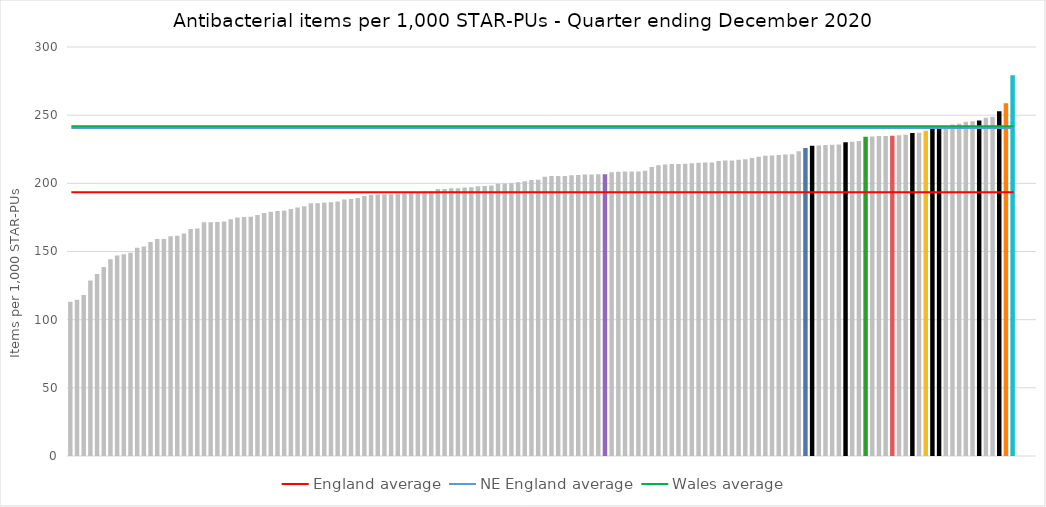
| Category | Series 0 |
|---|---|
| English CCGs | 113.118 |
| English CCGs | 114.574 |
| English CCGs | 118.122 |
| English CCGs | 128.676 |
| English CCGs | 133.566 |
| English CCGs | 138.655 |
| English CCGs | 144.385 |
| English CCGs | 147.027 |
| English CCGs | 147.967 |
| English CCGs | 149.154 |
| English CCGs | 152.735 |
| English CCGs | 153.717 |
| English CCGs | 157.052 |
| English CCGs | 159.171 |
| English CCGs | 159.256 |
| English CCGs | 161.14 |
| English CCGs | 161.487 |
| English CCGs | 163.287 |
| English CCGs | 166.45 |
| English CCGs | 166.822 |
| English CCGs | 171.433 |
| English CCGs | 171.503 |
| English CCGs | 171.633 |
| English CCGs | 172.09 |
| English CCGs | 173.578 |
| English CCGs | 174.975 |
| English CCGs | 175.318 |
| English CCGs | 175.568 |
| English CCGs | 176.815 |
| English CCGs | 178.32 |
| English CCGs | 179.231 |
| English CCGs | 179.743 |
| English CCGs | 179.862 |
| English CCGs | 181.09 |
| English CCGs | 182.282 |
| English CCGs | 183.127 |
| English CCGs | 185.447 |
| English CCGs | 185.474 |
| English CCGs | 185.737 |
| English CCGs | 186.161 |
| English CCGs | 186.737 |
| English CCGs | 188.189 |
| English CCGs | 188.423 |
| English CCGs | 189.195 |
| English CCGs | 190.679 |
| English CCGs | 191.365 |
| English CCGs | 191.886 |
| English CCGs | 191.942 |
| English CCGs | 192.01 |
| English CCGs | 192.33 |
| English CCGs | 192.793 |
| English CCGs | 192.926 |
| English CCGs | 193.67 |
| English CCGs | 193.979 |
| English CCGs | 194.017 |
| English CCGs | 195.8 |
| English CCGs | 195.801 |
| English CCGs | 196.33 |
| English CCGs | 196.396 |
| English CCGs | 196.966 |
| English CCGs | 197.079 |
| English CCGs | 197.913 |
| English CCGs | 198.008 |
| English CCGs | 198.333 |
| English CCGs | 199.701 |
| English CCGs | 199.822 |
| English CCGs | 199.976 |
| English CCGs | 200.707 |
| English CCGs | 201.502 |
| English CCGs | 202.447 |
| English CCGs | 202.693 |
| English CCGs | 204.798 |
| English CCGs | 205.29 |
| English CCGs | 205.313 |
| English CCGs | 205.342 |
| English CCGs | 205.842 |
| English CCGs | 206.164 |
| English CCGs | 206.419 |
| English CCGs | 206.439 |
| English CCGs | 206.578 |
| Powys  | 206.678 |
| English CCGs | 208.076 |
| English CCGs | 208.464 |
| English CCGs | 208.591 |
| English CCGs | 208.719 |
| English CCGs | 208.72 |
| English CCGs | 209.202 |
| English CCGs | 211.95 |
| English CCGs | 213.301 |
| English CCGs | 213.757 |
| English CCGs | 214.09 |
| English CCGs | 214.103 |
| English CCGs | 214.403 |
| English CCGs | 214.679 |
| English CCGs | 215.138 |
| English CCGs | 215.216 |
| English CCGs | 215.306 |
| English CCGs | 216.414 |
| English CCGs | 216.785 |
| English CCGs | 216.815 |
| English CCGs | 217.211 |
| English CCGs | 217.644 |
| English CCGs | 218.604 |
| English CCGs | 219.585 |
| English CCGs | 220.154 |
| English CCGs | 220.352 |
| English CCGs | 220.691 |
| English CCGs | 221.216 |
| English CCGs | 221.251 |
| English CCGs | 223.463 |
| Cardiff and Vale | 225.975 |
| NE England | 227.541 |
| English CCGs | 227.674 |
| English CCGs | 228.175 |
| English CCGs | 228.247 |
| English CCGs | 228.418 |
| NE England | 230.211 |
| English CCGs | 230.429 |
| English CCGs | 231.011 |
| BCU | 234.198 |
| English CCGs | 234.328 |
| English CCGs | 234.722 |
| English CCGs | 234.749 |
| Hywel Dda | 234.831 |
| English CCGs | 235.31 |
| English CCGs | 235.594 |
| NE England | 236.831 |
| English CCGs | 237.03 |
| Aneurin Bevan | 238.523 |
| NE England | 240.614 |
| NE England | 241.877 |
| English CCGs | 241.948 |
| English CCGs | 243.216 |
| English CCGs | 243.784 |
| English CCGs | 245.255 |
| English CCGs | 245.576 |
| NE England | 246.171 |
| English CCGs | 248.144 |
| English CCGs | 248.772 |
| NE England | 252.88 |
| Swansea Bay UHB | 258.779 |
| Cwm Taf Morgannwg UHB | 279.192 |